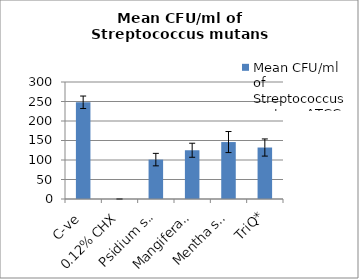
| Category | Mean CFU/ml of Streptococcus mutans ATCC 25175 |
|---|---|
| C-ve | 248 |
| 0.12% CHX | 0 |
| Psidium sp. | 101 |
| Mangifera sp. | 125 |
| Mentha sp. | 146 |
| TriQ* | 132 |